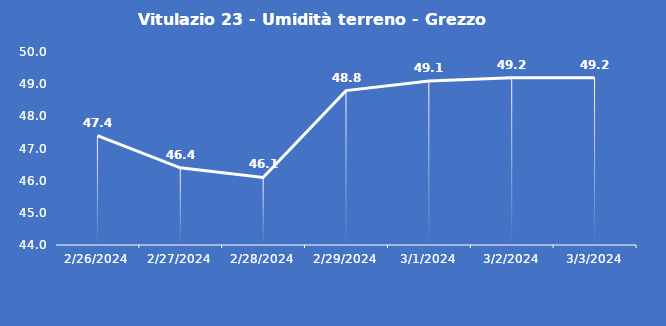
| Category | Vitulazio 23 - Umidità terreno - Grezzo (%VWC) |
|---|---|
| 2/26/24 | 47.4 |
| 2/27/24 | 46.4 |
| 2/28/24 | 46.1 |
| 2/29/24 | 48.8 |
| 3/1/24 | 49.1 |
| 3/2/24 | 49.2 |
| 3/3/24 | 49.2 |